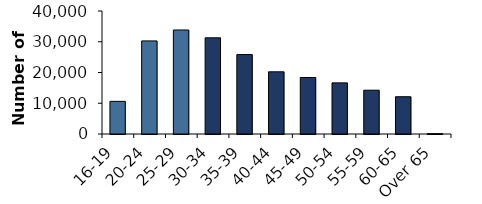
| Category | Series 1 |
|---|---|
| 16-19 | 10618 |
| 20-24 | 30271 |
| 25-29 | 33825 |
| 30-34 | 31276 |
| 35-39 | 25830 |
| 40-44 | 20226 |
| 45-49 | 18378 |
| 50-54 | 16627 |
| 55-59 | 14241 |
| 60-65 | 12121 |
| Over 65 | 105 |